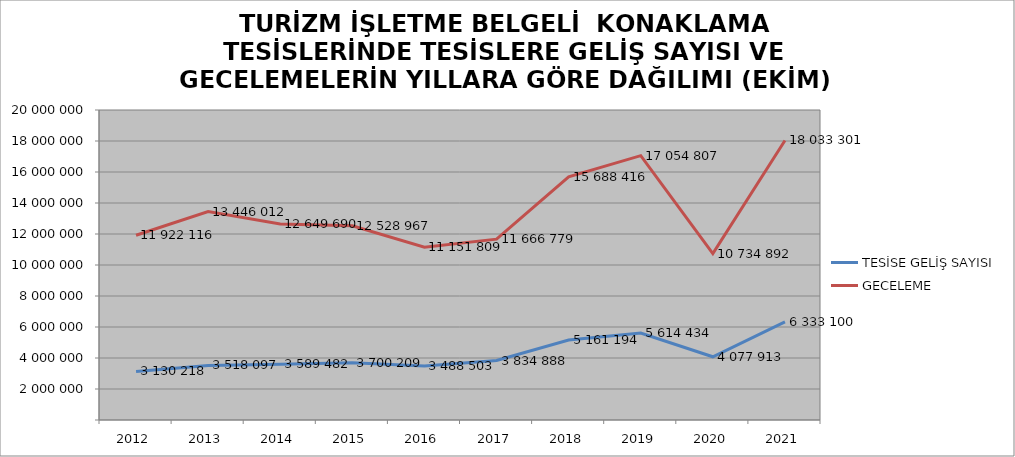
| Category | TESİSE GELİŞ SAYISI | GECELEME |
|---|---|---|
| 2012 | 3130218 | 11922116 |
| 2013 | 3518097 | 13446012 |
| 2014 | 3589482 | 12649690 |
| 2015 | 3700209 | 12528967 |
| 2016 | 3488503 | 11151809 |
| 2017 | 3834888 | 11666779 |
| 2018 | 5161194 | 15688416 |
| 2019 | 5614434 | 17054807 |
| 2020 | 4077913 | 10734892 |
| 2021 | 6333100 | 18033301 |